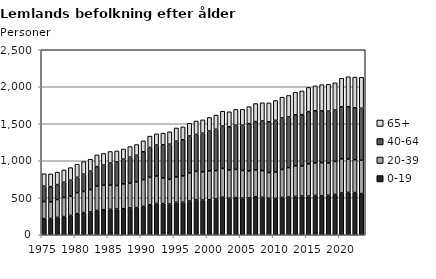
| Category | 0-19 | 20-39 | 40-64 | 65+ |
|---|---|---|---|---|
| 1975.0 | 218 | 230 | 208 | 169 |
| 1976.0 | 221 | 224 | 205 | 172 |
| 1977.0 | 235 | 241 | 202 | 169 |
| 1978.0 | 246 | 257 | 206 | 167 |
| 1979.0 | 261 | 260 | 216 | 170 |
| 1980.0 | 285 | 285 | 206 | 178 |
| 1981.0 | 300 | 285 | 233 | 170 |
| 1982.0 | 308 | 302 | 249 | 161 |
| 1983.0 | 328 | 329 | 264 | 158 |
| 1984.0 | 339 | 331 | 270 | 159 |
| 1985.0 | 343 | 327 | 299 | 156 |
| 1986.0 | 347 | 318 | 319 | 149 |
| 1987.0 | 351 | 337 | 333 | 138 |
| 1988.0 | 363 | 334 | 351 | 144 |
| 1989.0 | 367 | 348 | 359 | 145 |
| 1990.0 | 384 | 362 | 376 | 147 |
| 1991.0 | 406 | 370 | 404 | 153 |
| 1992.0 | 423 | 370 | 419 | 151 |
| 1993.0 | 421 | 347 | 447 | 159 |
| 1994.0 | 414 | 335 | 475 | 167 |
| 1995.0 | 438 | 344 | 482 | 179 |
| 1996.0 | 439 | 356 | 489 | 174 |
| 1997.0 | 456 | 378 | 500 | 172 |
| 1998.0 | 471 | 386 | 499 | 181 |
| 1999.0 | 468 | 383 | 520 | 182 |
| 2000.0 | 472 | 392 | 537 | 184 |
| 2001.0 | 483 | 384 | 558 | 193 |
| 2002.0 | 507 | 389 | 573 | 201 |
| 2003.0 | 494 | 381 | 585 | 202 |
| 2004.0 | 502 | 381 | 598 | 213 |
| 2005.0 | 494 | 375 | 611 | 215 |
| 2006.0 | 497 | 366 | 638 | 230 |
| 2007.0 | 513 | 364 | 652 | 244 |
| 2008.0 | 506 | 361 | 670 | 246 |
| 2009.0 | 494 | 347 | 685 | 256 |
| 2010.0 | 492 | 354 | 700 | 268 |
| 2011.0 | 504 | 378 | 696 | 282 |
| 2012.0 | 510 | 397 | 684 | 292 |
| 2013.0 | 518 | 415 | 688 | 305 |
| 2014.0 | 523 | 407 | 693 | 320 |
| 2015.0 | 521 | 437 | 706 | 327 |
| 2016.0 | 532 | 440 | 704 | 336 |
| 2017.0 | 525 | 450 | 700 | 353 |
| 2018.0 | 534 | 436 | 700 | 363 |
| 2019.0 | 546 | 445 | 693 | 369 |
| 2020.0 | 565 | 462 | 702 | 385 |
| 2021.0 | 572 | 451 | 707 | 405 |
| 2022.0 | 570 | 444 | 702 | 415 |
| 2023.0 | 557 | 450 | 702 | 418 |